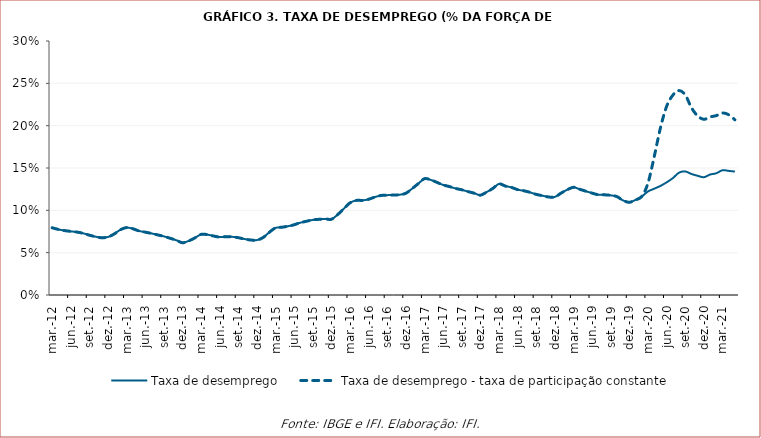
| Category | Taxa de desemprego | Taxa de desemprego - taxa de participação constante |
|---|---|---|
| 2012-03-01 | 0.079 | 0.079 |
| 2012-04-01 | 0.077 | 0.077 |
| 2012-05-01 | 0.076 | 0.076 |
| 2012-06-01 | 0.075 | 0.075 |
| 2012-07-01 | 0.074 | 0.074 |
| 2012-08-01 | 0.073 | 0.073 |
| 2012-09-01 | 0.071 | 0.071 |
| 2012-10-01 | 0.069 | 0.069 |
| 2012-11-01 | 0.068 | 0.068 |
| 2012-12-01 | 0.069 | 0.069 |
| 2013-01-01 | 0.072 | 0.072 |
| 2013-02-01 | 0.077 | 0.077 |
| 2013-03-01 | 0.08 | 0.08 |
| 2013-04-01 | 0.078 | 0.078 |
| 2013-05-01 | 0.076 | 0.076 |
| 2013-06-01 | 0.074 | 0.074 |
| 2013-07-01 | 0.073 | 0.073 |
| 2013-08-01 | 0.071 | 0.071 |
| 2013-09-01 | 0.069 | 0.069 |
| 2013-10-01 | 0.067 | 0.067 |
| 2013-11-01 | 0.065 | 0.065 |
| 2013-12-01 | 0.062 | 0.062 |
| 2014-01-01 | 0.064 | 0.064 |
| 2014-02-01 | 0.067 | 0.067 |
| 2014-03-01 | 0.072 | 0.072 |
| 2014-04-01 | 0.071 | 0.071 |
| 2014-05-01 | 0.07 | 0.07 |
| 2014-06-01 | 0.068 | 0.068 |
| 2014-07-01 | 0.069 | 0.069 |
| 2014-08-01 | 0.069 | 0.069 |
| 2014-09-01 | 0.068 | 0.068 |
| 2014-10-01 | 0.066 | 0.066 |
| 2014-11-01 | 0.065 | 0.065 |
| 2014-12-01 | 0.065 | 0.065 |
| 2015-01-01 | 0.068 | 0.068 |
| 2015-02-01 | 0.074 | 0.074 |
| 2015-03-01 | 0.079 | 0.079 |
| 2015-04-01 | 0.08 | 0.08 |
| 2015-05-01 | 0.081 | 0.081 |
| 2015-06-01 | 0.083 | 0.083 |
| 2015-07-01 | 0.085 | 0.085 |
| 2015-08-01 | 0.087 | 0.087 |
| 2015-09-01 | 0.089 | 0.089 |
| 2015-10-01 | 0.089 | 0.089 |
| 2015-11-01 | 0.09 | 0.09 |
| 2015-12-01 | 0.089 | 0.089 |
| 2016-01-01 | 0.095 | 0.095 |
| 2016-02-01 | 0.102 | 0.102 |
| 2016-03-01 | 0.109 | 0.109 |
| 2016-04-01 | 0.112 | 0.112 |
| 2016-05-01 | 0.112 | 0.112 |
| 2016-06-01 | 0.113 | 0.113 |
| 2016-07-01 | 0.116 | 0.116 |
| 2016-08-01 | 0.118 | 0.118 |
| 2016-09-01 | 0.118 | 0.118 |
| 2016-10-01 | 0.118 | 0.118 |
| 2016-11-01 | 0.118 | 0.118 |
| 2016-12-01 | 0.12 | 0.12 |
| 2017-01-01 | 0.126 | 0.126 |
| 2017-02-01 | 0.132 | 0.132 |
| 2017-03-01 | 0.137 | 0.137 |
| 2017-04-01 | 0.136 | 0.136 |
| 2017-05-01 | 0.133 | 0.133 |
| 2017-06-01 | 0.13 | 0.13 |
| 2017-07-01 | 0.128 | 0.128 |
| 2017-08-01 | 0.126 | 0.126 |
| 2017-09-01 | 0.124 | 0.124 |
| 2017-10-01 | 0.122 | 0.122 |
| 2017-11-01 | 0.12 | 0.12 |
| 2017-12-01 | 0.118 | 0.118 |
| 2018-01-01 | 0.122 | 0.122 |
| 2018-02-01 | 0.126 | 0.126 |
| 2018-03-01 | 0.131 | 0.131 |
| 2018-04-01 | 0.129 | 0.129 |
| 2018-05-01 | 0.127 | 0.127 |
| 2018-06-01 | 0.124 | 0.124 |
| 2018-07-01 | 0.123 | 0.123 |
| 2018-08-01 | 0.121 | 0.121 |
| 2018-09-01 | 0.119 | 0.119 |
| 2018-10-01 | 0.117 | 0.117 |
| 2018-11-01 | 0.116 | 0.116 |
| 2018-12-01 | 0.116 | 0.116 |
| 2019-01-01 | 0.12 | 0.12 |
| 2019-02-01 | 0.124 | 0.124 |
| 2019-03-01 | 0.127 | 0.127 |
| 2019-04-01 | 0.125 | 0.125 |
| 2019-05-01 | 0.123 | 0.123 |
| 2019-06-01 | 0.12 | 0.12 |
| 2019-07-01 | 0.118 | 0.118 |
| 2019-08-01 | 0.118 | 0.118 |
| 2019-09-01 | 0.118 | 0.118 |
| 2019-10-01 | 0.116 | 0.116 |
| 2019-11-01 | 0.112 | 0.112 |
| 2019-12-01 | 0.11 | 0.11 |
| 2020-01-01 | 0.112 | 0.112 |
| 2020-02-01 | 0.116 | 0.116 |
| 2020-03-01 | 0.122 | 0.132 |
| 2020-04-01 | 0.126 | 0.163 |
| 2020-05-01 | 0.129 | 0.197 |
| 2020-06-01 | 0.133 | 0.223 |
| 2020-07-01 | 0.138 | 0.236 |
| 2020-08-01 | 0.145 | 0.241 |
| 2020-09-01 | 0.146 | 0.236 |
| 2020-10-01 | 0.143 | 0.221 |
| 2020-11-01 | 0.141 | 0.212 |
| 2020-12-01 | 0.139 | 0.208 |
| 2021-01-01 | 0.142 | 0.21 |
| 2021-02-01 | 0.144 | 0.212 |
| 2021-03-01 | 0.147 | 0.215 |
| 2021-04-01 | 0.147 | 0.213 |
| 2021-05-01 | 0.146 | 0.207 |